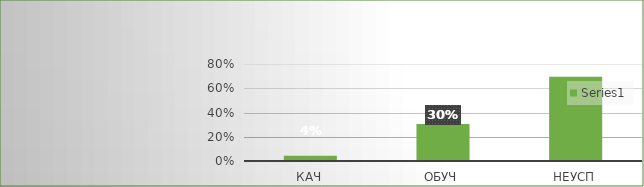
| Category | Series 0 |
|---|---|
| кач | 0.043 |
| обуч | 0.304 |
| неусп | 0.696 |